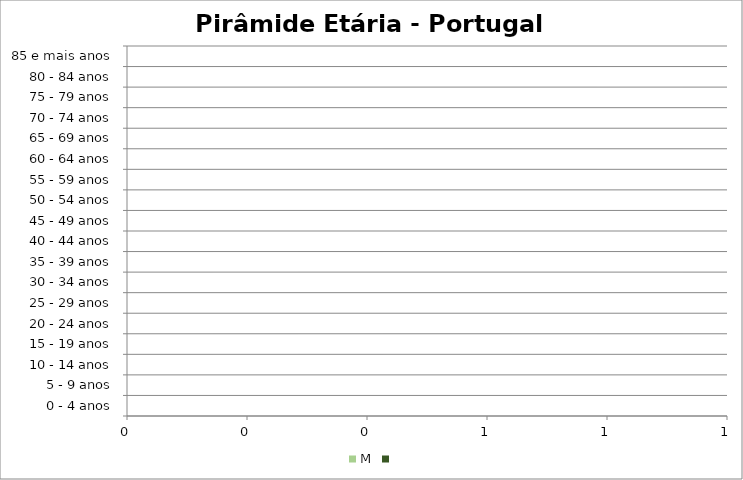
| Category | M | #REF! |
|---|---|---|
| 0 - 4 anos | 210449 | -220012 |
| 5 - 9 anos | 228539 | -238215 |
| 10 - 14 anos | 249639 | -260712 |
| 15 - 19 anos | 270414 | -282330 |
| 20 - 24 anos | 265978 | -272727 |
| 25 - 29 anos | 274710 | -272620 |
| 30 - 34 anos | 293745 | -282370 |
| 35 - 39 anos | 357170 | -328594 |
| 40 - 44 anos | 419405 | -381711 |
| 45 - 49 anos | 406993 | -368384 |
| 50 - 54 anos | 395886 | -354097 |
| 55 - 59 anos | 386514 | -342424 |
| 60 - 64 anos | 357656 | -311098 |
| 65 - 69 anos | 333878 | -284295 |
| 70 - 74 anos | 301711 | -236729 |
| 75 - 79 anos | 246993 | -179163 |
| 80 - 84 anos | 214396 | -136786 |
| 85 e mais anos | 210175 | -100099 |